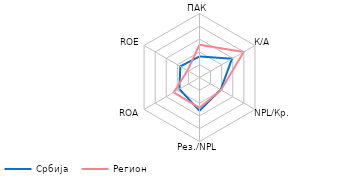
| Category | Србија | Регион |
|---|---|---|
| ПАК | 1.645 | 2.559 |
| К/А | 2.931 | 3.982 |
| NPL/Кр. | 1.911 | 1.946 |
| Рез./NPL | 2.592 | 2.372 |
| ROA | 1.813 | 2.324 |
| ROE | 1.732 | 1.086 |